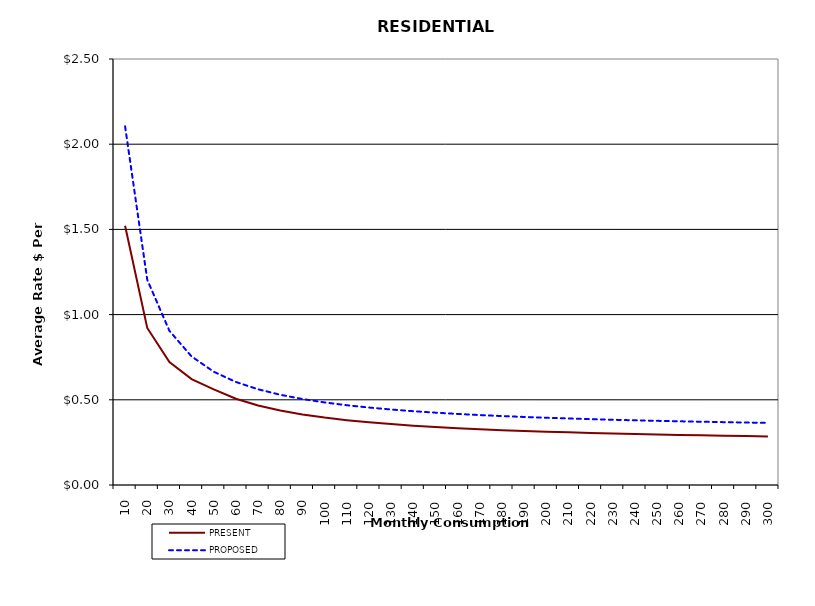
| Category | PRESENT | PROPOSED |
|---|---|---|
| 10.0 | 1.521 | 2.105 |
| 20.0 | 0.922 | 1.204 |
| 30.0 | 0.721 | 0.905 |
| 40.0 | 0.621 | 0.754 |
| 50.0 | 0.561 | 0.665 |
| 60.0 | 0.506 | 0.604 |
| 70.0 | 0.467 | 0.562 |
| 80.0 | 0.437 | 0.53 |
| 90.0 | 0.414 | 0.505 |
| 100.0 | 0.396 | 0.485 |
| 110.0 | 0.381 | 0.468 |
| 120.0 | 0.368 | 0.455 |
| 130.0 | 0.357 | 0.443 |
| 140.0 | 0.348 | 0.433 |
| 150.0 | 0.34 | 0.425 |
| 160.0 | 0.334 | 0.417 |
| 170.0 | 0.327 | 0.41 |
| 180.0 | 0.322 | 0.405 |
| 190.0 | 0.317 | 0.399 |
| 200.0 | 0.313 | 0.395 |
| 210.0 | 0.309 | 0.39 |
| 220.0 | 0.305 | 0.386 |
| 230.0 | 0.302 | 0.383 |
| 240.0 | 0.299 | 0.38 |
| 250.0 | 0.296 | 0.377 |
| 260.0 | 0.294 | 0.374 |
| 270.0 | 0.291 | 0.371 |
| 280.0 | 0.289 | 0.369 |
| 290.0 | 0.287 | 0.367 |
| 300.0 | 0.285 | 0.365 |